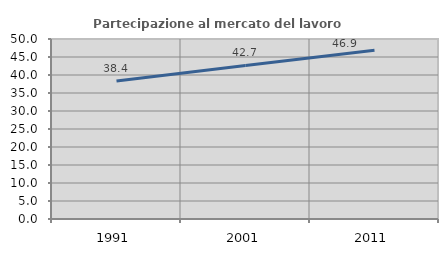
| Category | Partecipazione al mercato del lavoro  femminile |
|---|---|
| 1991.0 | 38.363 |
| 2001.0 | 42.659 |
| 2011.0 | 46.863 |